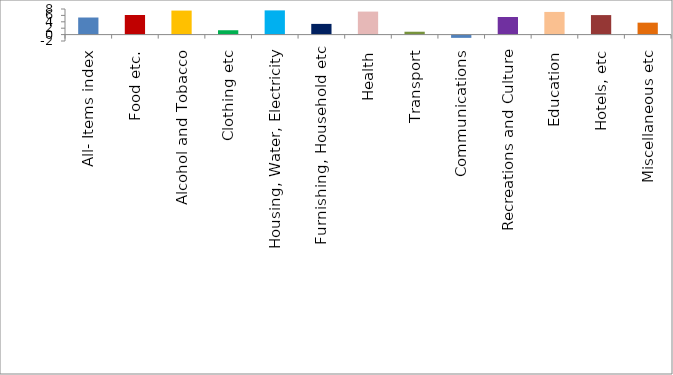
| Category | Series 0 |
|---|---|
| All- Items index | 5.34 |
| Food etc. | 6.12 |
| Alcohol and Tobacco | 7.505 |
| Clothing etc | 1.364 |
| Housing, Water, Electricity | 7.568 |
| Furnishing, Household etc | 3.346 |
| Health | 7.193 |
| Transport | 0.899 |
| Communications | -1.019 |
| Recreations and Culture | 5.493 |
| Education | 7.084 |
| Hotels, etc | 6.1 |
| Miscellaneous etc | 3.731 |